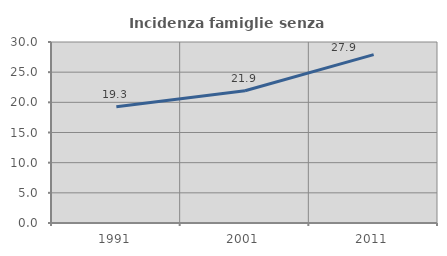
| Category | Incidenza famiglie senza nuclei |
|---|---|
| 1991.0 | 19.263 |
| 2001.0 | 21.917 |
| 2011.0 | 27.908 |